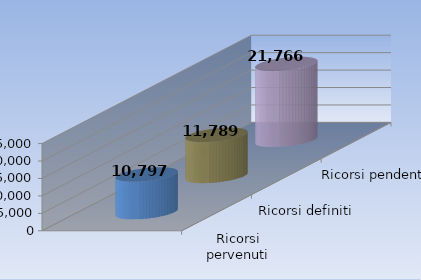
| Category | Ricorsi pervenuti | Ricorsi definiti | Ricorsi pendenti |
|---|---|---|---|
| 0 | 10797 | 11789 | 21766 |